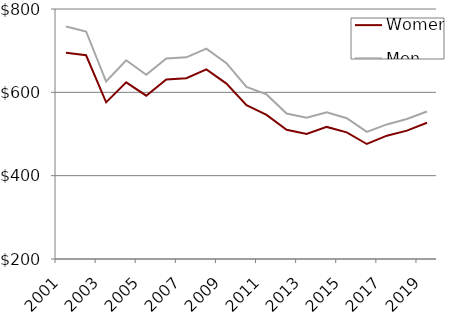
| Category | Women | Men |
|---|---|---|
| 2001.0 | 695 | 758 |
| 2002.0 | 689 | 746 |
| 2003.0 | 576 | 626 |
| 2004.0 | 624 | 677 |
| 2005.0 | 592 | 642 |
| 2006.0 | 631 | 681 |
| 2007.0 | 634 | 684 |
| 2008.0 | 655 | 705 |
| 2009.0 | 621 | 670 |
| 2010.0 | 569 | 613 |
| 2011.0 | 546 | 595 |
| 2012.0 | 510 | 549 |
| 2013.0 | 500 | 539 |
| 2014.0 | 517 | 552 |
| 2015.0 | 504 | 538 |
| 2016.0 | 476 | 505 |
| 2017.0 | 496 | 523 |
| 2018.0 | 508 | 536 |
| 2019.0 | 527 | 554 |